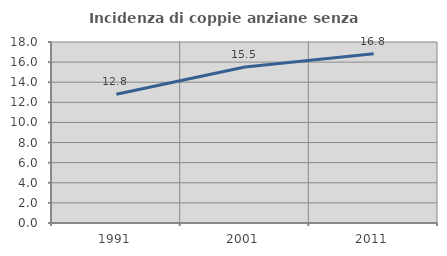
| Category | Incidenza di coppie anziane senza figli  |
|---|---|
| 1991.0 | 12.799 |
| 2001.0 | 15.512 |
| 2011.0 | 16.832 |